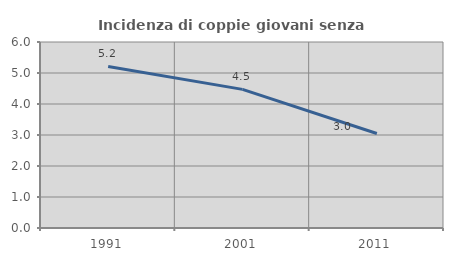
| Category | Incidenza di coppie giovani senza figli |
|---|---|
| 1991.0 | 5.21 |
| 2001.0 | 4.471 |
| 2011.0 | 3.048 |